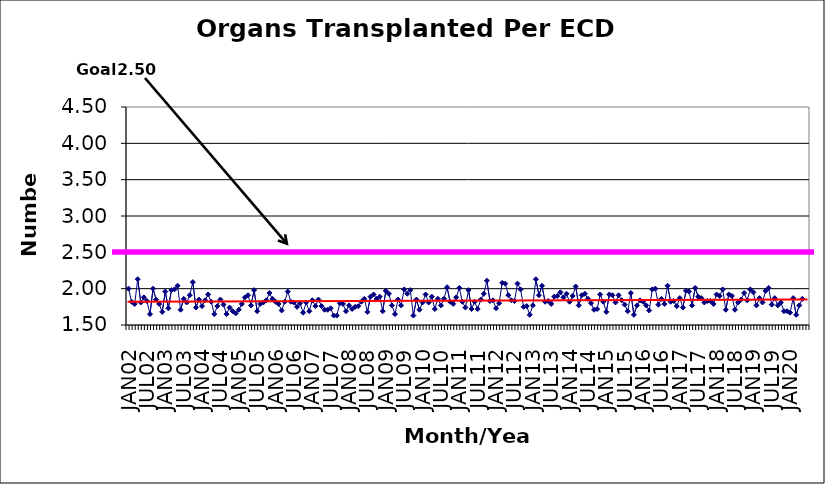
| Category | Series 0 |
|---|---|
| JAN02 | 2 |
| FEB02 | 1.82 |
| MAR02 | 1.79 |
| APR02 | 2.13 |
| MAY02 | 1.81 |
| JUN02 | 1.88 |
| JUL02 | 1.83 |
| AUG02 | 1.65 |
| SEP02 | 2 |
| OCT02 | 1.85 |
| NOV02 | 1.79 |
| DEC02 | 1.68 |
| JAN03 | 1.96 |
| FEB03 | 1.73 |
| MAR03 | 1.98 |
| APR03 | 1.99 |
| MAY03 | 2.04 |
| JUN03 | 1.71 |
| JUL03 | 1.86 |
| AUG03 | 1.81 |
| SEP03 | 1.91 |
| OCT03 | 2.09 |
| NOV03 | 1.74 |
| DEC03 | 1.85 |
| JAN04 | 1.76 |
| FEB04 | 1.84 |
| MAR04 | 1.92 |
| APR04 | 1.82 |
| MAY04 | 1.65 |
| JUN04 | 1.76 |
| JUL04 | 1.85 |
| AUG04 | 1.78 |
| SEP04 | 1.65 |
| OCT04 | 1.74 |
| NOV04 | 1.69 |
| DEC04 | 1.66 |
| JAN05 | 1.71 |
| FEB05 | 1.79 |
| MAR05 | 1.88 |
| APR05 | 1.91 |
| MAY05 | 1.77 |
| JUN05 | 1.98 |
| JUL05 | 1.69 |
| AUG05 | 1.79 |
| SEP05 | 1.81 |
| OCT05 | 1.84 |
| NOV05 | 1.94 |
| DEC05 | 1.86 |
| JAN06 | 1.82 |
| FEB06 | 1.79 |
| MAR06 | 1.7 |
| APR06 | 1.82 |
| MAY06 | 1.96 |
| JUN06 | 1.82 |
| JUL06 | 1.81 |
| AUG06 | 1.75 |
| SEP06 | 1.8 |
| OCT06 | 1.67 |
| NOV06 | 1.81 |
| DEC06 | 1.69 |
| JAN07 | 1.84 |
| FEB07 | 1.76 |
| MAR07 | 1.85 |
| APR07 | 1.76 |
| MAY07 | 1.71 |
| JUN07 | 1.71 |
| JUL07 | 1.73 |
| AUG07 | 1.63 |
| SEP07 | 1.63 |
| OCT07 | 1.8 |
| NOV07 | 1.79 |
| DEC07 | 1.69 |
| JAN08 | 1.77 |
| FEB08 | 1.72 |
| MAR08 | 1.75 |
| APR08 | 1.76 |
| MAY08 | 1.82 |
| JUN08 | 1.86 |
| JUL08 | 1.68 |
| AUG08 | 1.89 |
| SEP08 | 1.92 |
| OCT08 | 1.86 |
| NOV08 | 1.89 |
| DEC08 | 1.69 |
| JAN09 | 1.97 |
| FEB09 | 1.93 |
| MAR09 | 1.77 |
| APR09 | 1.65 |
| MAY09 | 1.85 |
| JUN09 | 1.77 |
| JUL09 | 1.99 |
| AUG09 | 1.93 |
| SEP09 | 1.98 |
| OCT09 | 1.63 |
| NOV09 | 1.85 |
| DEC09 | 1.71 |
| JAN10 | 1.81 |
| FEB10 | 1.92 |
| MAR10 | 1.81 |
| APR10 | 1.89 |
| MAY10 | 1.72 |
| JUN10 | 1.86 |
| JUL10 | 1.77 |
| AUG10 | 1.86 |
| SEP10 | 2.02 |
| OCT10 | 1.82 |
| NOV10 | 1.79 |
| DEC10 | 1.88 |
| JAN11 | 2.01 |
| FEB11 | 1.82 |
| MAR11 | 1.74 |
| APR11 | 1.98 |
| MAY11 | 1.72 |
| JUN11 | 1.82 |
| JUL11 | 1.72 |
| AUG11 | 1.85 |
| SEP11 | 1.93 |
| OCT11 | 2.11 |
| NOV11 | 1.83 |
| DEC11 | 1.84 |
| JAN12 | 1.73 |
| FEB12 | 1.8 |
| MAR12 | 2.08 |
| APR12 | 2.07 |
| MAY12 | 1.91 |
| JUN12 | 1.84 |
| JUL12 | 1.83 |
| AUG12 | 2.07 |
| SEP12 | 1.99 |
| OCT12 | 1.75 |
| NOV12 | 1.76 |
| DEC12 | 1.64 |
| JAN13 | 1.77 |
| FEB13 | 2.13 |
| MAR13 | 1.91 |
| APR13 | 2.04 |
| MAY13 | 1.82 |
| JUN13 | 1.83 |
| JUL13 | 1.79 |
| AUG13 | 1.89 |
| SEP13 | 1.9 |
| OCT13 | 1.95 |
| NOV13 | 1.88 |
| DEC13 | 1.93 |
| JAN14 | 1.82 |
| FEB14 | 1.9 |
| MAR14 | 2.03 |
| APR14 | 1.77 |
| MAY14 | 1.91 |
| JUN14 | 1.93 |
| JUL14 | 1.86 |
| AUG14 | 1.8 |
| SEP14 | 1.71 |
| OCT14 | 1.72 |
| NOV14 | 1.92 |
| DEC14 | 1.82 |
| JAN15 | 1.68 |
| FEB15 | 1.92 |
| MAR15 | 1.91 |
| APR15 | 1.81 |
| MAY15 | 1.91 |
| JUN15 | 1.84 |
| JUL15 | 1.78 |
| AUG15 | 1.69 |
| SEP15 | 1.94 |
| OCT15 | 1.64 |
| NOV15 | 1.77 |
| DEC15 | 1.84 |
| JAN16 | 1.82 |
| FEB16 | 1.77 |
| MAR16 | 1.7 |
| APR16 | 1.99 |
| MAY16 | 2 |
| JUN16 | 1.78 |
| JUL16 | 1.86 |
| AUG16 | 1.79 |
| SEP16 | 2.04 |
| OCT16 | 1.82 |
| NOV16 | 1.83 |
| DEC16 | 1.76 |
| JAN17 | 1.87 |
| FEB17 | 1.74 |
| MAR17 | 1.97 |
| APR17 | 1.96 |
| MAY17 | 1.77 |
| JUN17 | 2.01 |
| JUL17 | 1.89 |
| AUG17 | 1.87 |
| SEP17 | 1.81 |
| OCT17 | 1.83 |
| NOV17 | 1.83 |
| DEC17 | 1.79 |
| JAN18 | 1.92 |
| FEB18 | 1.9 |
| MAR18 | 1.99 |
| APR18 | 1.71 |
| MAY18 | 1.92 |
| JUN18 | 1.9 |
| JUL18 | 1.71 |
| AUG18 | 1.81 |
| SEP18 | 1.85 |
| OCT18 | 1.94 |
| NOV18 | 1.84 |
| DEC18 | 1.99 |
| JAN19 | 1.95 |
| FEB19 | 1.77 |
| MAR19 | 1.87 |
| APR19 | 1.81 |
| MAY19 | 1.97 |
| JUN19 | 2.01 |
| JUL19 | 1.78 |
| AUG19 | 1.87 |
| SEP19 | 1.77 |
| OCT19 | 1.81 |
| NOV19 | 1.69 |
| DEC19 | 1.69 |
| JAN20 | 1.67 |
| FEB20 | 1.87 |
| MAR20 | 1.64 |
| APR20 | 1.77 |
| MAY20 | 1.86 |